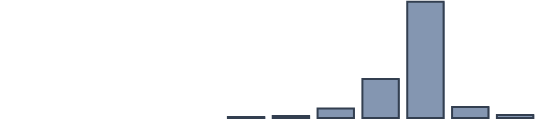
| Category | Series 0 |
|---|---|
| 0 | 0 |
| 1 | 0 |
| 2 | 0 |
| 3 | 0 |
| 4 | 0 |
| 5 | 0.5 |
| 6 | 1.1 |
| 7 | 5.3 |
| 8 | 21.5 |
| 9 | 64.1 |
| 10 | 6 |
| 11 | 1.6 |